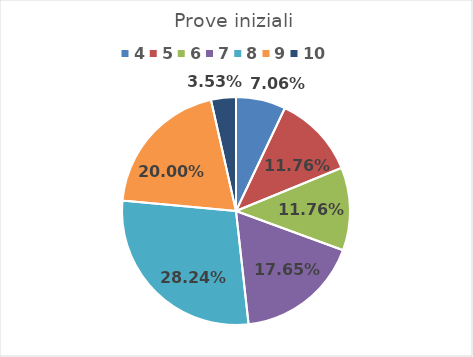
| Category | Series 0 |
|---|---|
| 4.0 | 0.071 |
| 5.0 | 0.118 |
| 6.0 | 0.118 |
| 7.0 | 0.176 |
| 8.0 | 0.282 |
| 9.0 | 0.2 |
| 10.0 | 0.035 |